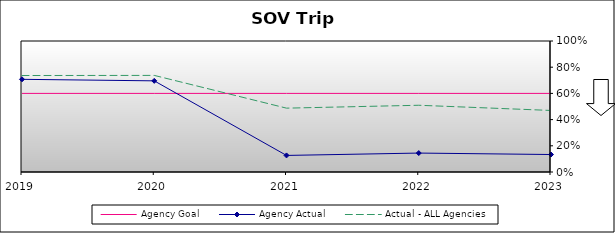
| Category | Agency Goal | Agency Actual | Actual - ALL Agencies |
|---|---|---|---|
| 2019.0 | 0.6 | 0.708 | 0.736 |
| 2020.0 | 0.6 | 0.696 | 0.737 |
| 2021.0 | 0.6 | 0.126 | 0.487 |
| 2022.0 | 0.6 | 0.144 | 0.509 |
| 2023.0 | 0.6 | 0.133 | 0.47 |